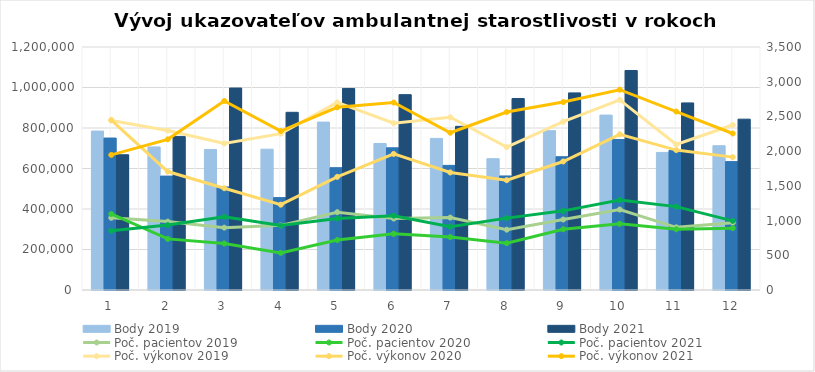
| Category | Body 2019 | Body 2020 | Body 2021 |
|---|---|---|---|
| 0 | 784680 | 750460 | 667890 |
| 1 | 706540 | 562430 | 758430 |
| 2 | 694120 | 508960 | 997300 |
| 3 | 695300 | 456230 | 877510 |
| 4 | 829050 | 604010 | 995270 |
| 5 | 723460 | 702180 | 964680 |
| 6 | 748650 | 615440 | 808260 |
| 7 | 648540 | 563260 | 945720 |
| 8 | 786830 | 658210 | 973450 |
| 9 | 863770 | 743240 | 1084060 |
| 10 | 679360 | 689720 | 923890 |
| 11 | 712650 | 633960 | 843620 |